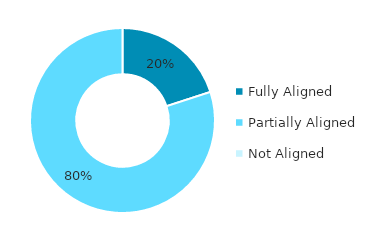
| Category | Series 0 |
|---|---|
| Fully Aligned | 0.2 |
| Partially Aligned | 0.8 |
| Not Aligned | 0 |